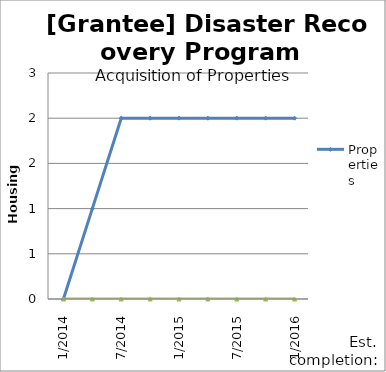
| Category | Properties | Actual Properties Acquired |
|---|---|---|
| 1/2014 | 0 | 0 |
| 4/2014 | 1 | 0 |
| 7/2014 | 2 | 0 |
| 10/2014 | 2 | 0 |
| 1/2015 | 2 | 0 |
| 4/2015 | 2 | 0 |
| 7/2015 | 2 | 0 |
| 10/2015 | 2 | 0 |
| 1/2016 | 2 | 0 |